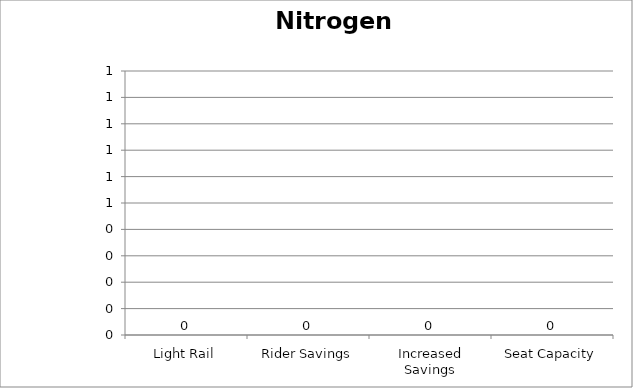
| Category | Nitrogen Oxides |
|---|---|
| Light Rail | 0 |
| Rider Savings | 0 |
| Increased Savings | 0 |
| Seat Capacity | 0 |